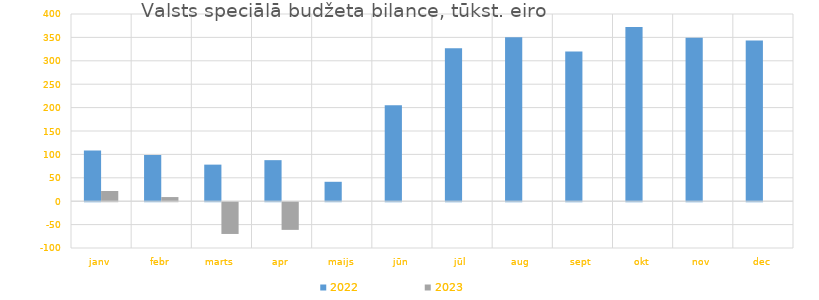
| Category | 2022 | 2023 |
|---|---|---|
| janv | 108554.179 | 21850.373 |
| febr | 98735.641 | 8860.895 |
| marts | 78145.563 | -67878.961 |
| apr | 87696.664 | -59148.923 |
| maijs | 41467.941 | 0 |
| jūn | 205002.224 | 0 |
| jūl | 326863.351 | 0 |
| aug | 350378.42 | 0 |
| sept | 320128.894 | 0 |
| okt | 371998.298 | 0 |
| nov | 349474.929 | 0 |
| dec | 343526.239 | 0 |